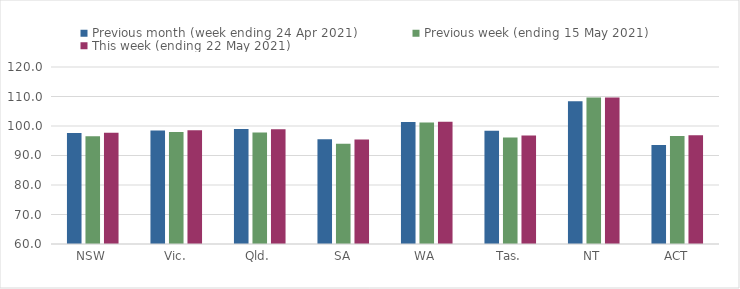
| Category | Previous month (week ending 24 Apr 2021) | Previous week (ending 15 May 2021) | This week (ending 22 May 2021) |
|---|---|---|---|
| NSW | 97.64 | 96.51 | 97.69 |
| Vic. | 98.51 | 97.99 | 98.58 |
| Qld. | 99 | 97.81 | 98.93 |
| SA | 95.54 | 94.02 | 95.43 |
| WA | 101.37 | 101.22 | 101.47 |
| Tas. | 98.36 | 96.14 | 96.75 |
| NT | 108.37 | 109.69 | 109.69 |
| ACT | 93.59 | 96.62 | 96.83 |